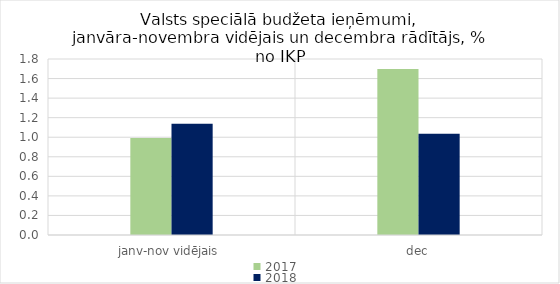
| Category | 2017 | 2018 |
|---|---|---|
| janv-nov vidējais | 0.992 | 1.137 |
| dec | 1.698 | 1.036 |